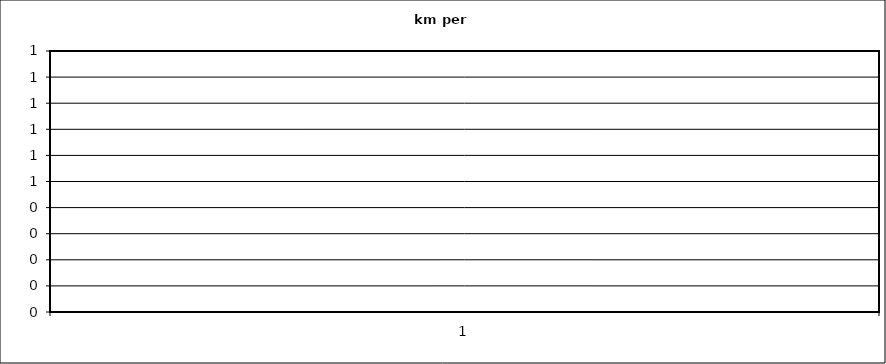
| Category | Series 0 | Series 1 | Series 2 | Series 3 | Series 4 | Series 5 | Series 6 | Series 7 | Series 8 | Series 9 | Series 10 | Series 11 | Series 12 | Series 13 | Series 14 | Series 15 | Series 16 | Series 17 | Series 18 | Series 19 | Series 20 | Series 21 | Series 22 | Series 23 | Series 24 | Series 25 | Series 26 | Series 27 | Series 28 | Series 29 | Series 30 | Series 31 | Series 32 | Series 33 | Series 34 | Series 35 | Series 36 | Series 37 | Series 38 | Series 39 | Series 40 | Series 41 | Series 42 | Series 43 | Series 44 | Series 45 | Series 46 | Series 47 | Series 48 | Series 49 | Series 50 | Series 51 | Series 52 |
|---|---|---|---|---|---|---|---|---|---|---|---|---|---|---|---|---|---|---|---|---|---|---|---|---|---|---|---|---|---|---|---|---|---|---|---|---|---|---|---|---|---|---|---|---|---|---|---|---|---|---|---|---|---|
| 0 | 0 | 0 | 0 | 0 | 0 | 0 | 0 | 0 | 0 | 0 | 0 | 0 | 0 | 0 | 0 | 0 | 0 | 0 | 0 | 0 | 0 | 0 | 0 | 0 | 0 | 0 | 0 | 0 | 0 | 0 | 0 | 0 | 0 | 0 | 0 | 0 | 0 | 0 | 0 | 0 | 0 | 0 | 0 | 0 | 0 | 0 | 0 | 0 | 0 | 0 | 0 | 0 | 0 |